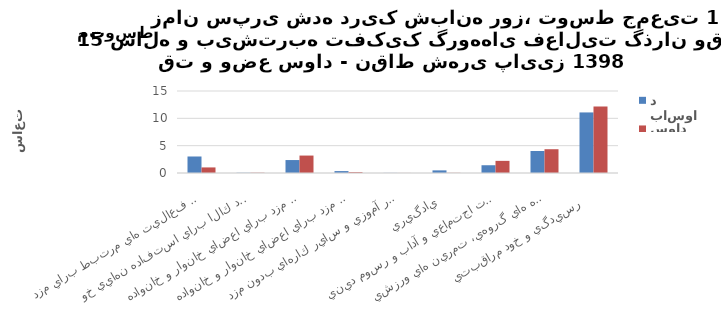
| Category | باسواد | بي سواد |
|---|---|---|
| اشتغال و فعاليت هاي مرتبط براي مزد  | 3.02 | 1.02 |
| توليد كالا براي استفاده نهايي خود   | 0.04 | 0.05 |
| خدمات خانگي بدون مزد براي اعضاي خانوار و خانواده   | 2.37 | 3.19 |
| خدمات مراقبتي بدون مزد براي اعضاي خانوار و خانواده   | 0.35 | 0.15 |
| كارداوطلبانه بدون مزد، كار آموزي و ساير كارهاي بدون مزد  | 0.02 | 0.01 |
| يادگيري  | 0.48 | 0.03 |
| معاشرت، ارتباط، مشاركت اجتماعي و آداب و رسوم ديني  | 1.42 | 2.22 |
| فرهنگ، فراغت، رسانه هاي گروهي، تمرين هاي ورزشي  | 4.03 | 4.35 |
| رسيدگي و خود مراقبتي   | 11.08 | 12.17 |